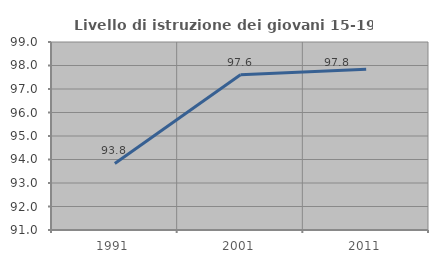
| Category | Livello di istruzione dei giovani 15-19 anni |
|---|---|
| 1991.0 | 93.833 |
| 2001.0 | 97.605 |
| 2011.0 | 97.838 |